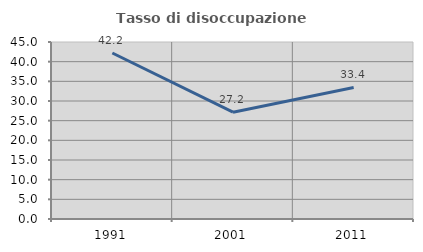
| Category | Tasso di disoccupazione giovanile  |
|---|---|
| 1991.0 | 42.199 |
| 2001.0 | 27.159 |
| 2011.0 | 33.442 |